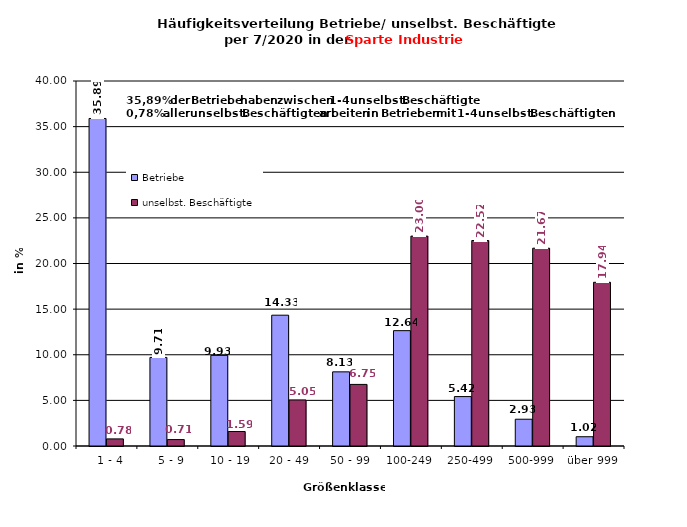
| Category | Betriebe | unselbst. Beschäftigte |
|---|---|---|
|   1 - 4 | 35.892 | 0.779 |
|   5 - 9 | 9.707 | 0.705 |
|  10 - 19 | 9.932 | 1.587 |
| 20 - 49 | 14.334 | 5.045 |
| 50 - 99 | 8.126 | 6.748 |
| 100-249 | 12.641 | 23.001 |
| 250-499 | 5.418 | 22.519 |
| 500-999 | 2.935 | 21.675 |
| über 999 | 1.016 | 17.94 |